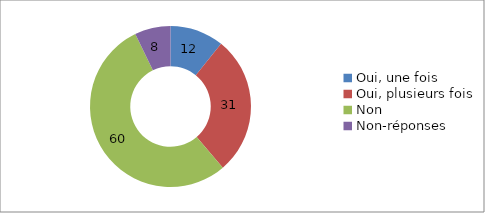
| Category | Series 0 |
|---|---|
| Oui, une fois | 12 |
| Oui, plusieurs fois | 31 |
| Non | 60 |
| Non-réponses | 8 |